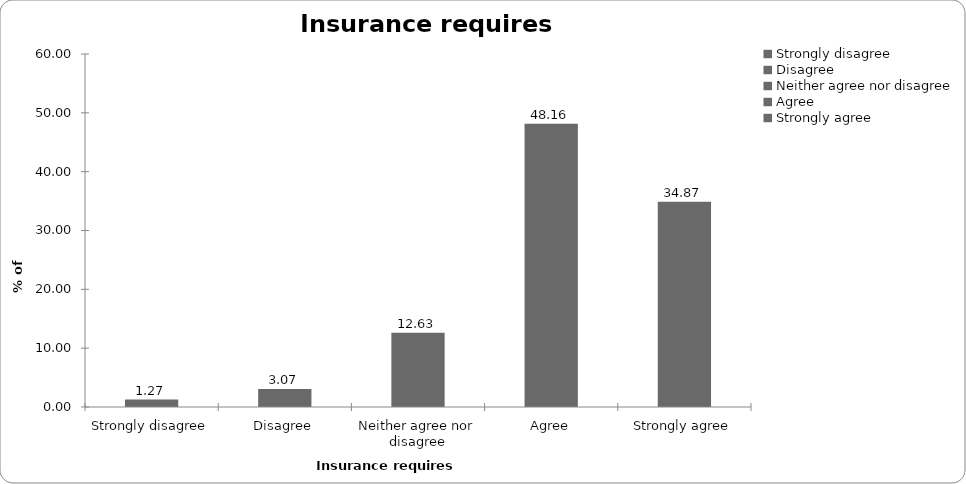
| Category | Insurance requires regulation |
|---|---|
| Strongly disagree | 1.269 |
| Disagree | 3.073 |
| Neither agree nor disagree | 12.625 |
| Agree | 48.163 |
| Strongly agree | 34.87 |